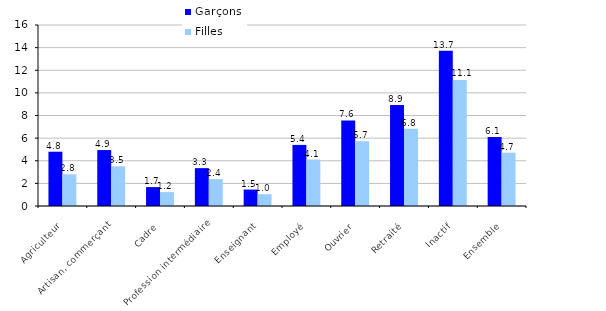
| Category | Garçons | Filles |
|---|---|---|
| Agriculteur | 4.798 | 2.8 |
| Artisan, commerçant | 4.945 | 3.513 |
| Cadre | 1.671 | 1.228 |
| Profession intermédiaire | 3.347 | 2.376 |
| Enseignant | 1.454 | 1.043 |
| Employé | 5.401 | 4.103 |
| Ouvrier | 7.56 | 5.717 |
| Retraité | 8.937 | 6.824 |
| Inactif | 13.723 | 11.144 |
| Ensemble | 6.102 | 4.711 |